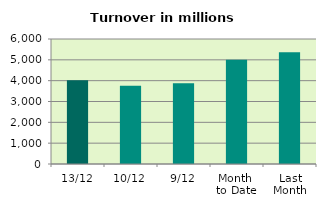
| Category | Series 0 |
|---|---|
| 13/12 | 4025.891 |
| 10/12 | 3759.788 |
| 9/12 | 3873.421 |
| Month 
to Date | 4999.791 |
| Last
Month | 5362.851 |